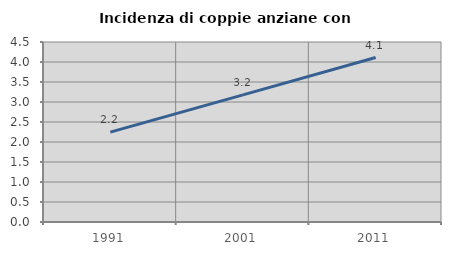
| Category | Incidenza di coppie anziane con figli |
|---|---|
| 1991.0 | 2.246 |
| 2001.0 | 3.178 |
| 2011.0 | 4.112 |